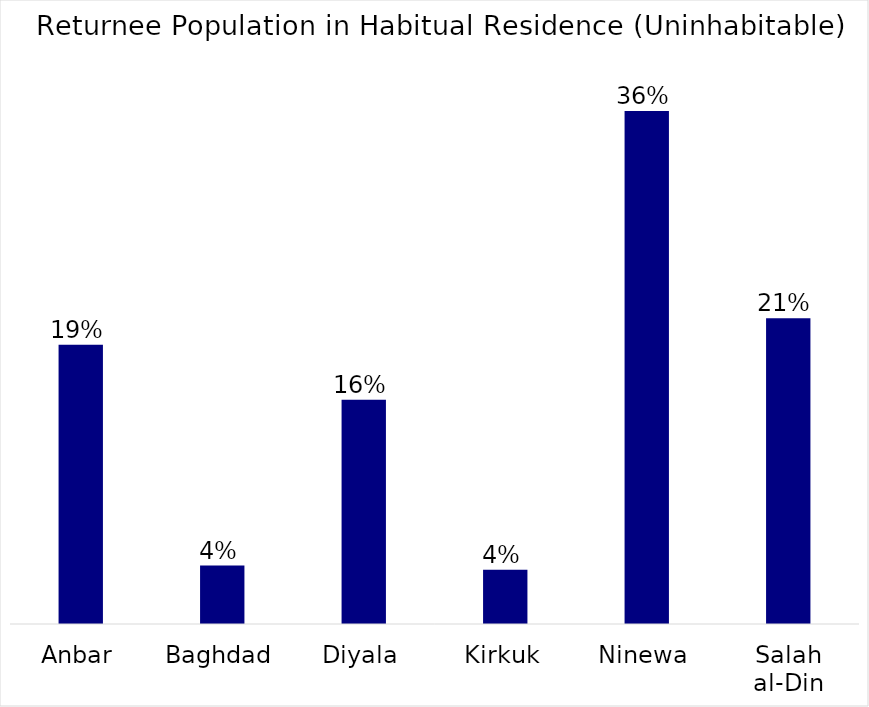
| Category | Series 0 |
|---|---|
| Anbar | 0.195 |
| Baghdad | 0.041 |
| Diyala | 0.156 |
| Kirkuk | 0.038 |
| Ninewa | 0.358 |
| Salah al-Din | 0.213 |